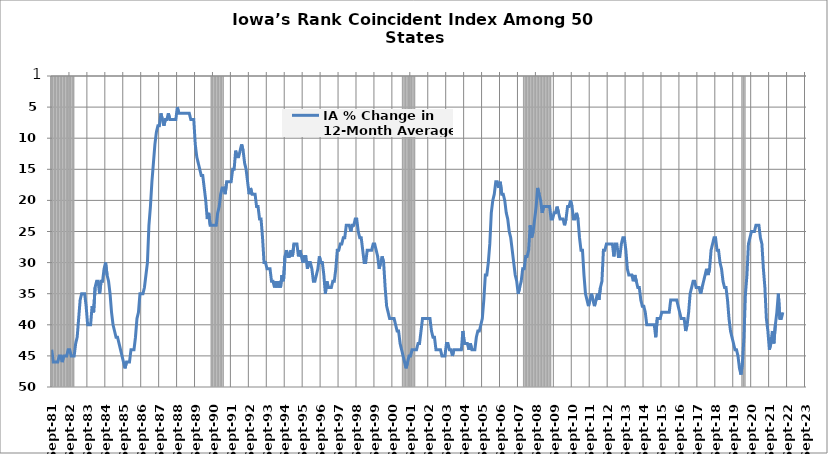
| Category | Series 1 |
|---|---|
| 1981-09-01 | 20000 |
| 1981-10-01 | 20000 |
| 1981-11-01 | 20000 |
| 1981-12-01 | 20000 |
| 1982-01-01 | 20000 |
| 1982-02-01 | 20000 |
| 1982-03-01 | 20000 |
| 1982-04-01 | 20000 |
| 1982-05-01 | 20000 |
| 1982-06-01 | 20000 |
| 1982-07-01 | 20000 |
| 1982-08-01 | 20000 |
| 1982-09-01 | 20000 |
| 1982-10-01 | 20000 |
| 1982-11-01 | 20000 |
| 1982-12-01 | 0 |
| 1983-01-01 | 0 |
| 1983-02-01 | 0 |
| 1983-03-01 | 0 |
| 1983-04-01 | 0 |
| 1983-05-01 | 0 |
| 1983-06-01 | 0 |
| 1983-07-01 | 0 |
| 1983-08-01 | 0 |
| 1983-09-01 | 0 |
| 1983-10-01 | 0 |
| 1983-11-01 | 0 |
| 1983-12-01 | 0 |
| 1984-01-01 | 0 |
| 1984-02-01 | 0 |
| 1984-03-01 | 0 |
| 1984-04-01 | 0 |
| 1984-05-01 | 0 |
| 1984-06-01 | 0 |
| 1984-07-01 | 0 |
| 1984-08-01 | 0 |
| 1984-09-01 | 0 |
| 1984-10-01 | 0 |
| 1984-11-01 | 0 |
| 1984-12-01 | 0 |
| 1985-01-01 | 0 |
| 1985-02-01 | 0 |
| 1985-03-01 | 0 |
| 1985-04-01 | 0 |
| 1985-05-01 | 0 |
| 1985-06-01 | 0 |
| 1985-07-01 | 0 |
| 1985-08-01 | 0 |
| 1985-09-01 | 0 |
| 1985-10-01 | 0 |
| 1985-11-01 | 0 |
| 1985-12-01 | 0 |
| 1986-01-01 | 0 |
| 1986-02-01 | 0 |
| 1986-03-01 | 0 |
| 1986-04-01 | 0 |
| 1986-05-01 | 0 |
| 1986-06-01 | 0 |
| 1986-07-01 | 0 |
| 1986-08-01 | 0 |
| 1986-09-01 | 0 |
| 1986-10-01 | 0 |
| 1986-11-01 | 0 |
| 1986-12-01 | 0 |
| 1987-01-01 | 0 |
| 1987-02-01 | 0 |
| 1987-03-01 | 0 |
| 1987-04-01 | 0 |
| 1987-05-01 | 0 |
| 1987-06-01 | 0 |
| 1987-07-01 | 0 |
| 1987-08-01 | 0 |
| 1987-09-01 | 0 |
| 1987-10-01 | 0 |
| 1987-11-01 | 0 |
| 1987-12-01 | 0 |
| 1988-01-01 | 0 |
| 1988-02-01 | 0 |
| 1988-03-01 | 0 |
| 1988-04-01 | 0 |
| 1988-05-01 | 0 |
| 1988-06-01 | 0 |
| 1988-07-01 | 0 |
| 1988-08-01 | 0 |
| 1988-09-01 | 0 |
| 1988-10-01 | 0 |
| 1988-11-01 | 0 |
| 1988-12-01 | 0 |
| 1989-01-01 | 0 |
| 1989-02-01 | 0 |
| 1989-03-01 | 0 |
| 1989-04-01 | 0 |
| 1989-05-01 | 0 |
| 1989-06-01 | 0 |
| 1989-07-01 | 0 |
| 1989-08-01 | 0 |
| 1989-09-01 | 0 |
| 1989-10-01 | 0 |
| 1989-11-01 | 0 |
| 1989-12-01 | 0 |
| 1990-01-01 | 0 |
| 1990-02-01 | 0 |
| 1990-03-01 | 0 |
| 1990-04-01 | 0 |
| 1990-05-01 | 0 |
| 1990-06-01 | 0 |
| 1990-07-01 | 20000 |
| 1990-08-01 | 20000 |
| 1990-09-01 | 20000 |
| 1990-10-01 | 20000 |
| 1990-11-01 | 20000 |
| 1990-12-01 | 20000 |
| 1991-01-01 | 20000 |
| 1991-02-01 | 20000 |
| 1991-03-01 | 20000 |
| 1991-04-01 | 0 |
| 1991-05-01 | 0 |
| 1991-06-01 | 0 |
| 1991-07-01 | 0 |
| 1991-08-01 | 0 |
| 1991-09-01 | 0 |
| 1991-10-01 | 0 |
| 1991-11-01 | 0 |
| 1991-12-01 | 0 |
| 1992-01-01 | 0 |
| 1992-02-01 | 0 |
| 1992-03-01 | 0 |
| 1992-04-01 | 0 |
| 1992-05-01 | 0 |
| 1992-06-01 | 0 |
| 1992-07-01 | 0 |
| 1992-08-01 | 0 |
| 1992-09-01 | 0 |
| 1992-10-01 | 0 |
| 1992-11-01 | 0 |
| 1992-12-01 | 0 |
| 1993-01-01 | 0 |
| 1993-02-01 | 0 |
| 1993-03-01 | 0 |
| 1993-04-01 | 0 |
| 1993-05-01 | 0 |
| 1993-06-01 | 0 |
| 1993-07-01 | 0 |
| 1993-08-01 | 0 |
| 1993-09-01 | 0 |
| 1993-10-01 | 0 |
| 1993-11-01 | 0 |
| 1993-12-01 | 0 |
| 1994-01-01 | 0 |
| 1994-02-01 | 0 |
| 1994-03-01 | 0 |
| 1994-04-01 | 0 |
| 1994-05-01 | 0 |
| 1994-06-01 | 0 |
| 1994-07-01 | 0 |
| 1994-08-01 | 0 |
| 1994-09-01 | 0 |
| 1994-10-01 | 0 |
| 1994-11-01 | 0 |
| 1994-12-01 | 0 |
| 1995-01-01 | 0 |
| 1995-02-01 | 0 |
| 1995-03-01 | 0 |
| 1995-04-01 | 0 |
| 1995-05-01 | 0 |
| 1995-06-01 | 0 |
| 1995-07-01 | 0 |
| 1995-08-01 | 0 |
| 1995-09-01 | 0 |
| 1995-10-01 | 0 |
| 1995-11-01 | 0 |
| 1995-12-01 | 0 |
| 1996-01-01 | 0 |
| 1996-02-01 | 0 |
| 1996-03-01 | 0 |
| 1996-04-01 | 0 |
| 1996-05-01 | 0 |
| 1996-06-01 | 0 |
| 1996-07-01 | 0 |
| 1996-08-01 | 0 |
| 1996-09-01 | 0 |
| 1996-10-01 | 0 |
| 1996-11-01 | 0 |
| 1996-12-01 | 0 |
| 1997-01-01 | 0 |
| 1997-02-01 | 0 |
| 1997-03-01 | 0 |
| 1997-04-01 | 0 |
| 1997-05-01 | 0 |
| 1997-06-01 | 0 |
| 1997-07-01 | 0 |
| 1997-08-01 | 0 |
| 1997-09-01 | 0 |
| 1997-10-01 | 0 |
| 1997-11-01 | 0 |
| 1997-12-01 | 0 |
| 1998-01-01 | 0 |
| 1998-02-01 | 0 |
| 1998-03-01 | 0 |
| 1998-04-01 | 0 |
| 1998-05-01 | 0 |
| 1998-06-01 | 0 |
| 1998-07-01 | 0 |
| 1998-08-01 | 0 |
| 1998-09-01 | 0 |
| 1998-10-01 | 0 |
| 1998-11-01 | 0 |
| 1998-12-01 | 0 |
| 1999-01-01 | 0 |
| 1999-02-01 | 0 |
| 1999-03-01 | 0 |
| 1999-04-01 | 0 |
| 1999-05-01 | 0 |
| 1999-06-01 | 0 |
| 1999-07-01 | 0 |
| 1999-08-01 | 0 |
| 1999-09-01 | 0 |
| 1999-10-01 | 0 |
| 1999-11-01 | 0 |
| 1999-12-01 | 0 |
| 2000-01-01 | 0 |
| 2000-02-01 | 0 |
| 2000-03-01 | 0 |
| 2000-04-01 | 0 |
| 2000-05-01 | 0 |
| 2000-06-01 | 0 |
| 2000-07-01 | 0 |
| 2000-08-01 | 0 |
| 2000-09-01 | 0 |
| 2000-10-01 | 0 |
| 2000-11-01 | 0 |
| 2000-12-01 | 0 |
| 2001-01-01 | 0 |
| 2001-02-01 | 0 |
| 2001-03-01 | 20000 |
| 2001-04-01 | 20000 |
| 2001-05-01 | 20000 |
| 2001-06-01 | 20000 |
| 2001-07-01 | 20000 |
| 2001-08-01 | 20000 |
| 2001-09-01 | 20000 |
| 2001-10-01 | 20000 |
| 2001-11-01 | 20000 |
| 2001-12-01 | 0 |
| 2002-01-01 | 0 |
| 2002-02-01 | 0 |
| 2002-03-01 | 0 |
| 2002-04-01 | 0 |
| 2002-05-01 | 0 |
| 2002-06-01 | 0 |
| 2002-07-01 | 0 |
| 2002-08-01 | 0 |
| 2002-09-01 | 0 |
| 2002-10-01 | 0 |
| 2002-11-01 | 0 |
| 2002-12-01 | 0 |
| 2003-01-01 | 0 |
| 2003-02-01 | 0 |
| 2003-03-01 | 0 |
| 2003-04-01 | 0 |
| 2003-05-01 | 0 |
| 2003-06-01 | 0 |
| 2003-07-01 | 0 |
| 2003-08-01 | 0 |
| 2003-09-01 | 0 |
| 2003-10-01 | 0 |
| 2003-11-01 | 0 |
| 2003-12-01 | 0 |
| 2004-01-01 | 0 |
| 2004-02-01 | 0 |
| 2004-03-01 | 0 |
| 2004-04-01 | 0 |
| 2004-05-01 | 0 |
| 2004-06-01 | 0 |
| 2004-07-01 | 0 |
| 2004-08-01 | 0 |
| 2004-09-01 | 0 |
| 2004-10-01 | 0 |
| 2004-11-01 | 0 |
| 2004-12-01 | 0 |
| 2005-01-01 | 0 |
| 2005-02-01 | 0 |
| 2005-03-01 | 0 |
| 2005-04-01 | 0 |
| 2005-05-01 | 0 |
| 2005-06-01 | 0 |
| 2005-07-01 | 0 |
| 2005-08-01 | 0 |
| 2005-09-01 | 0 |
| 2005-10-01 | 0 |
| 2005-11-01 | 0 |
| 2005-12-01 | 0 |
| 2006-01-01 | 0 |
| 2006-02-01 | 0 |
| 2006-03-01 | 0 |
| 2006-04-01 | 0 |
| 2006-05-01 | 0 |
| 2006-06-01 | 0 |
| 2006-07-01 | 0 |
| 2006-08-01 | 0 |
| 2006-09-01 | 0 |
| 2006-10-01 | 0 |
| 2006-11-01 | 0 |
| 2006-12-01 | 0 |
| 2007-01-01 | 0 |
| 2007-02-01 | 0 |
| 2007-03-01 | 0 |
| 2007-04-01 | 0 |
| 2007-05-01 | 0 |
| 2007-06-01 | 0 |
| 2007-07-01 | 0 |
| 2007-08-01 | 0 |
| 2007-09-01 | 0 |
| 2007-10-01 | 0 |
| 2007-11-01 | 0 |
| 2007-12-01 | 20000 |
| 2008-01-01 | 20000 |
| 2008-02-01 | 20000 |
| 2008-03-01 | 20000 |
| 2008-04-01 | 20000 |
| 2008-05-01 | 20000 |
| 2008-06-01 | 20000 |
| 2008-07-01 | 20000 |
| 2008-08-01 | 20000 |
| 2008-09-01 | 20000 |
| 2008-10-01 | 20000 |
| 2008-11-01 | 20000 |
| 2008-12-01 | 20000 |
| 2009-01-01 | 20000 |
| 2009-02-01 | 20000 |
| 2009-03-01 | 20000 |
| 2009-04-01 | 20000 |
| 2009-05-01 | 20000 |
| 2009-06-01 | 20000 |
| 2009-07-01 | 0 |
| 2009-08-01 | 0 |
| 2009-09-01 | 0 |
| 2009-10-01 | 0 |
| 2009-11-01 | 0 |
| 2009-12-01 | 0 |
| 2010-01-01 | 0 |
| 2010-02-01 | 0 |
| 2010-03-01 | 0 |
| 2010-04-01 | 0 |
| 2010-05-01 | 0 |
| 2010-06-01 | 0 |
| 2010-07-01 | 0 |
| 2010-08-01 | 0 |
| 2010-09-01 | 0 |
| 2010-10-01 | 0 |
| 2010-11-01 | 0 |
| 2010-12-01 | 0 |
| 2011-01-01 | 0 |
| 2011-02-01 | 0 |
| 2011-03-01 | 0 |
| 2011-04-01 | 0 |
| 2011-05-01 | 0 |
| 2011-06-01 | 0 |
| 2011-07-01 | 0 |
| 2011-08-01 | 0 |
| 2011-09-01 | 0 |
| 2011-10-01 | 0 |
| 2011-11-01 | 0 |
| 2011-12-01 | 0 |
| 2012-01-01 | 0 |
| 2012-02-01 | 0 |
| 2012-03-01 | 0 |
| 2012-04-01 | 0 |
| 2012-05-01 | 0 |
| 2012-06-01 | 0 |
| 2012-07-01 | 0 |
| 2012-08-01 | 0 |
| 2012-09-01 | 0 |
| 2012-10-01 | 0 |
| 2012-11-01 | 0 |
| 2012-12-01 | 0 |
| 2013-01-01 | 0 |
| 2013-02-01 | 0 |
| 2013-03-01 | 0 |
| 2013-04-01 | 0 |
| 2013-05-01 | 0 |
| 2013-06-01 | 0 |
| 2013-07-01 | 0 |
| 2013-08-01 | 0 |
| 2013-09-01 | 0 |
| 2013-10-01 | 0 |
| 2013-11-01 | 0 |
| 2013-12-01 | 0 |
| 2014-01-01 | 0 |
| 2014-02-01 | 0 |
| 2014-03-01 | 0 |
| 2014-04-01 | 0 |
| 2014-05-01 | 0 |
| 2014-06-01 | 0 |
| 2014-07-01 | 0 |
| 2014-08-01 | 0 |
| 2014-09-01 | 0 |
| 2014-10-01 | 0 |
| 2014-11-01 | 0 |
| 2014-12-01 | 0 |
| 2015-01-01 | 0 |
| 2015-02-01 | 0 |
| 2015-03-01 | 0 |
| 2015-04-01 | 0 |
| 2015-05-01 | 0 |
| 2015-06-01 | 0 |
| 2015-07-01 | 0 |
| 2015-08-01 | 0 |
| 2015-09-01 | 0 |
| 2015-10-01 | 0 |
| 2015-11-01 | 0 |
| 2015-12-01 | 0 |
| 2016-01-01 | 0 |
| 2016-02-01 | 0 |
| 2016-03-01 | 0 |
| 2016-04-01 | 0 |
| 2016-05-01 | 0 |
| 2016-06-01 | 0 |
| 2016-07-01 | 0 |
| 2016-08-01 | 0 |
| 2016-09-01 | 0 |
| 2016-10-01 | 0 |
| 2016-11-01 | 0 |
| 2016-12-01 | 0 |
| 2017-01-01 | 0 |
| 2017-02-01 | 0 |
| 2017-03-01 | 0 |
| 2017-04-01 | 0 |
| 2017-05-01 | 0 |
| 2017-06-01 | 0 |
| 2017-07-01 | 0 |
| 2017-08-01 | 0 |
| 2017-09-01 | 0 |
| 2017-10-01 | 0 |
| 2017-11-01 | 0 |
| 2017-12-01 | 0 |
| 2018-01-01 | 0 |
| 2018-02-01 | 0 |
| 2018-03-01 | 0 |
| 2018-04-01 | 0 |
| 2018-05-01 | 0 |
| 2018-06-01 | 0 |
| 2018-07-01 | 0 |
| 2018-08-01 | 0 |
| 2018-09-01 | 0 |
| 2018-10-01 | 0 |
| 2018-11-01 | 0 |
| 2018-12-01 | 0 |
| 2019-01-01 | 0 |
| 2019-02-01 | 0 |
| 2019-03-01 | 0 |
| 2019-04-01 | 0 |
| 2019-05-01 | 0 |
| 2019-06-01 | 0 |
| 2019-07-01 | 0 |
| 2019-08-01 | 0 |
| 2019-09-01 | 0 |
| 2019-10-01 | 0 |
| 2019-11-01 | 0 |
| 2019-12-01 | 0 |
| 2020-01-01 | 0 |
| 2020-02-01 | 20000 |
| 2020-03-01 | 20000 |
| 2020-04-01 | 20000 |
| 2020-05-01 | 0 |
| 2020-06-01 | 0 |
| 2020-07-01 | 0 |
| 2020-08-01 | 0 |
| 2020-09-01 | 0 |
| 2020-10-01 | 0 |
| 2020-11-01 | 0 |
| 2020-12-01 | 0 |
| 2021-01-01 | 0 |
| 2021-02-01 | 0 |
| 2021-03-01 | 0 |
| 2021-04-01 | 0 |
| 2021-05-01 | 0 |
| 2021-06-01 | 0 |
| 2021-07-01 | 0 |
| 2021-08-01 | 0 |
| 2021-09-01 | 0 |
| 2021-10-01 | 0 |
| 2021-11-01 | 0 |
| 2021-12-01 | 0 |
| 2022-01-01 | 0 |
| 2022-02-01 | 0 |
| 2022-03-01 | 0 |
| 2022-04-01 | 0 |
| 2022-05-01 | 0 |
| 2022-06-01 | 0 |